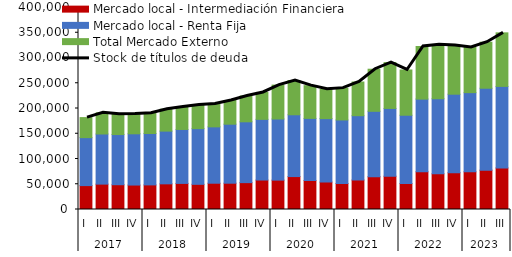
| Category | Mercado local - Intermediación Financiera | Mercado local - Renta Fija | Total Mercado Externo |
|---|---|---|---|
| 0 | 47319.336 | 94987.59 | 39699.532 |
| 1 | 50257.391 | 99244.145 | 41883.972 |
| 2 | 49082.431 | 99321.472 | 40410.761 |
| 3 | 48422.76 | 101473.079 | 39426.986 |
| 4 | 48718.222 | 101732.303 | 40105.384 |
| 5 | 50821.43 | 104405.508 | 43340.068 |
| 6 | 51659.727 | 106847.496 | 44354.727 |
| 7 | 49856.484 | 110255.556 | 46687.209 |
| 8 | 52044.71 | 111590.197 | 45192.802 |
| 9 | 52068.512 | 116850.941 | 46955.176 |
| 10 | 53207.47 | 120424.904 | 51032.848 |
| 11 | 58338.263 | 120167.795 | 53267.565 |
| 12 | 58162.886 | 121052.994 | 67094.761 |
| 13 | 65219.047 | 122364.737 | 67880.928 |
| 14 | 57329.529 | 123107.948 | 64798.957 |
| 15 | 54291.801 | 125662.198 | 58077.352 |
| 16 | 51620.44 | 125695.92 | 62999.056 |
| 17 | 58403.598 | 127364.993 | 66694.532 |
| 18 | 65027.738 | 129406.998 | 83358.98 |
| 19 | 65942.903 | 134186.006 | 90777.643 |
| 20 | 51563.463 | 135103.126 | 89624.836 |
| 21 | 74772.933 | 143826.713 | 104166.644 |
| 22 | 70654.46 | 148666.096 | 107059.02 |
| 23 | 72888.479 | 155427.17 | 96601.061 |
| 24 | 74595.113 | 156826.673 | 89330.174 |
| 25 | 77950.557 | 162182.022 | 91147.709 |
| 26 | 82314.913 | 161465.052 | 106026.723 |